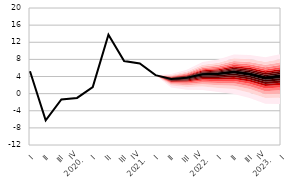
| Category | Series 0 |
|---|---|
| I | 5.234 |
| II | -6.254 |
| III | -1.349 |
| IV
2020. | -1 |
| I | 1.518 |
| II | 13.742 |
| III | 7.615 |
| IV
2021. | 7.024 |
| I | 4.315 |
| II | 3.431 |
| III | 3.721 |
| IV
2022. | 4.523 |
| I | 4.66 |
| II | 5.084 |
| III | 4.607 |
| IV
2023. | 3.7 |
| I | 4.111 |